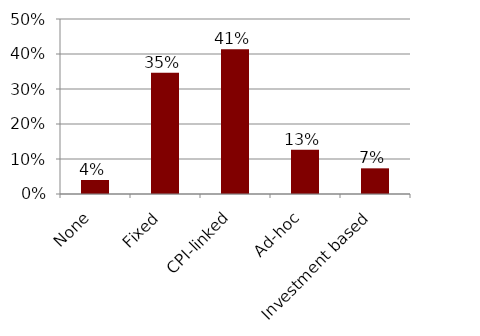
| Category | #REF! |
|---|---|
| None | 0.04 |
| Fixed | 0.347 |
| CPI-linked | 0.413 |
| Ad-hoc | 0.127 |
| Investment based | 0.073 |